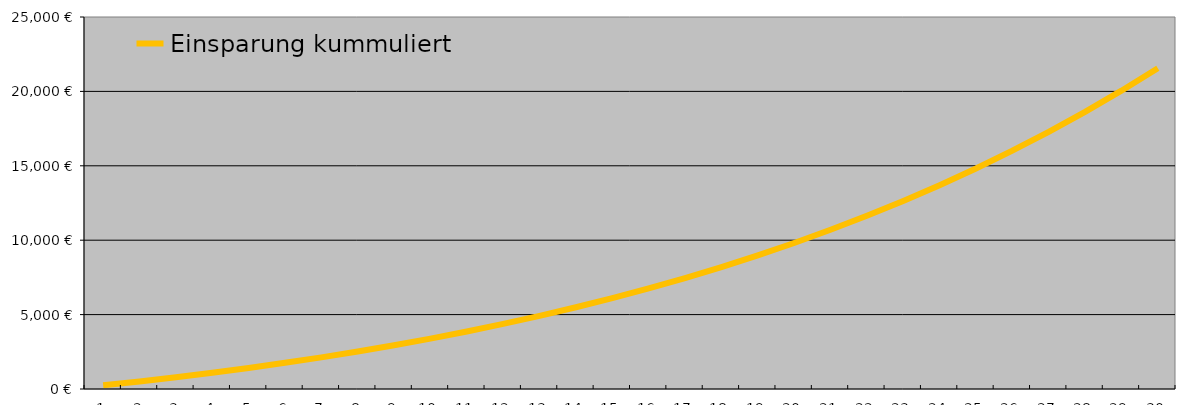
| Category | Einsparung kummuliert |
|---|---|
| 0 | 245 |
| 1 | 507.73 |
| 2 | 789.242 |
| 3 | 1090.646 |
| 4 | 1413.117 |
| 5 | 1757.893 |
| 6 | 2126.284 |
| 7 | 2519.672 |
| 8 | 2939.518 |
| 9 | 3387.362 |
| 10 | 3864.834 |
| 11 | 4373.654 |
| 12 | 4915.636 |
| 13 | 5492.697 |
| 14 | 6106.863 |
| 15 | 6760.27 |
| 16 | 7455.174 |
| 17 | 8193.96 |
| 18 | 8979.141 |
| 19 | 9813.373 |
| 20 | 10699.459 |
| 21 | 11640.36 |
| 22 | 12639.199 |
| 23 | 13699.275 |
| 24 | 14824.068 |
| 25 | 16017.253 |
| 26 | 17282.711 |
| 27 | 18624.535 |
| 28 | 20047.047 |
| 29 | 21554.809 |